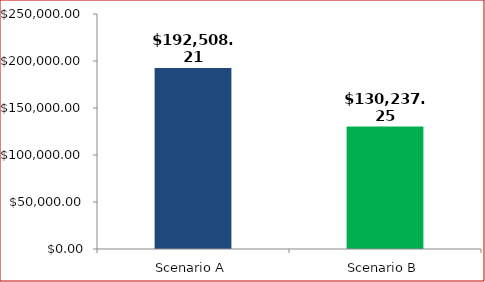
| Category | Lifetime Costs (Today's Dollars): |
|---|---|
| Scenario A | 192508.205 |
| Scenario B | 130237.252 |